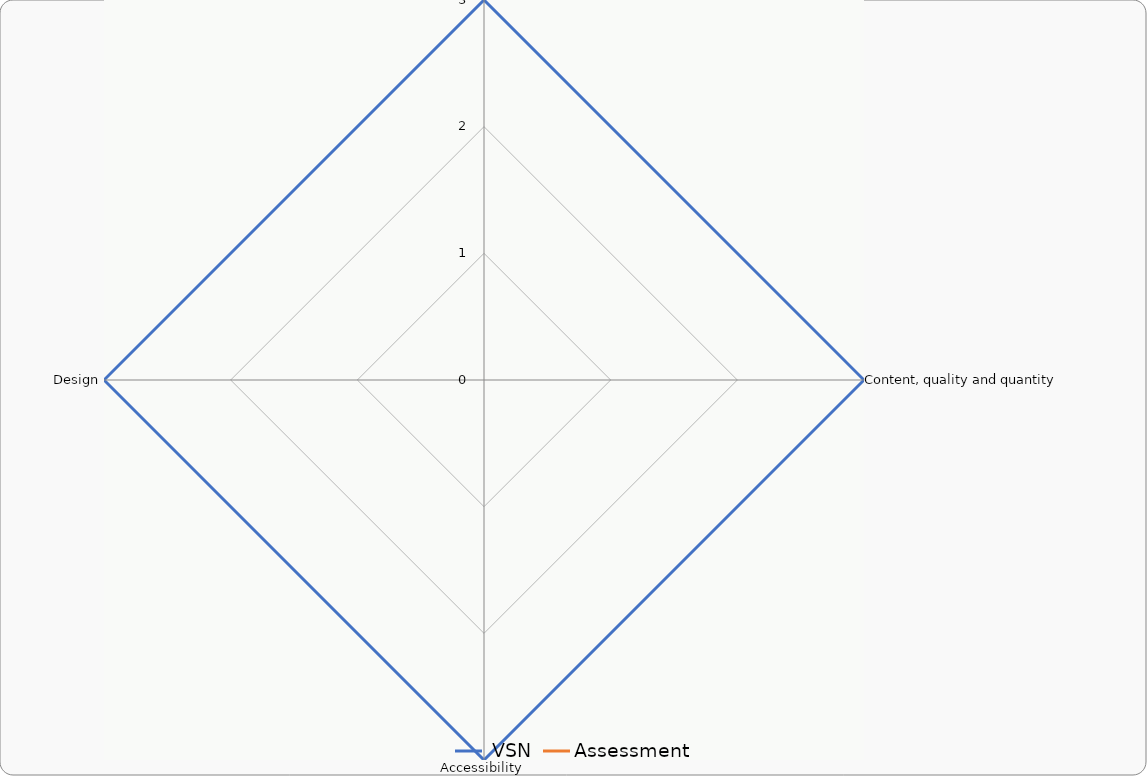
| Category |  VSN | Assessment |
|---|---|---|
| Credibility | 3 | 0 |
| Content, quality and quantity | 3 | 0 |
| Accessibility | 3 | 0 |
| Design | 3 | 0 |